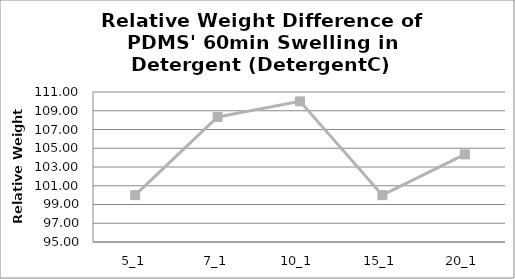
| Category | Relative weight (%) |
|---|---|
| 5_1 | 100 |
| 7_1 | 108.333 |
| 10_1 | 110 |
| 15_1 | 100 |
| 20_1 | 104.348 |